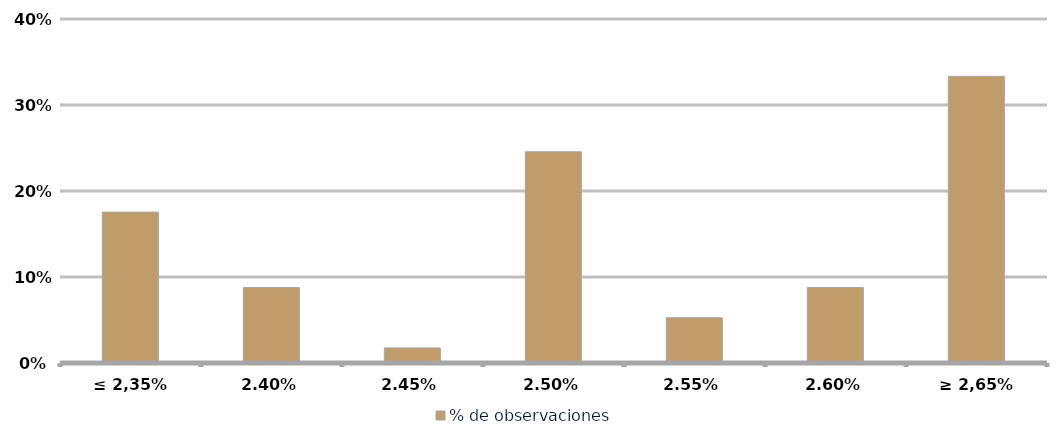
| Category | % de observaciones  |
|---|---|
| ≤ 2,35% | 0.175 |
| 2,40% | 0.088 |
| 2,45% | 0.018 |
| 2,50% | 0.246 |
| 2,55% | 0.053 |
| 2,60% | 0.088 |
| ≥ 2,65% | 0.333 |